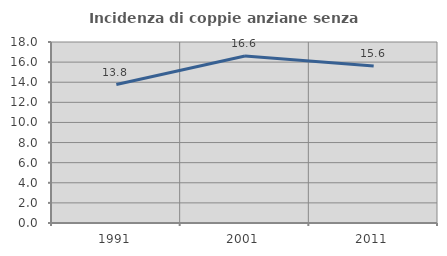
| Category | Incidenza di coppie anziane senza figli  |
|---|---|
| 1991.0 | 13.77 |
| 2001.0 | 16.61 |
| 2011.0 | 15.603 |